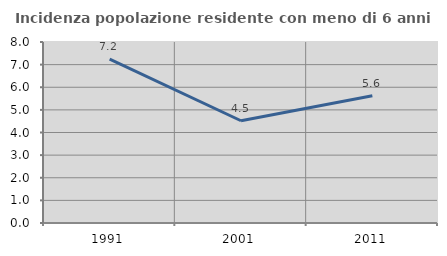
| Category | Incidenza popolazione residente con meno di 6 anni |
|---|---|
| 1991.0 | 7.246 |
| 2001.0 | 4.519 |
| 2011.0 | 5.622 |